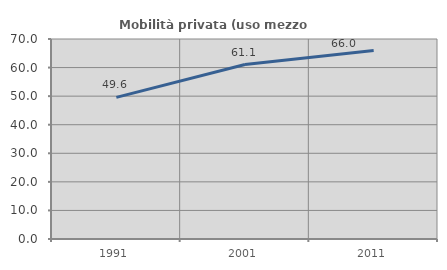
| Category | Mobilità privata (uso mezzo privato) |
|---|---|
| 1991.0 | 49.584 |
| 2001.0 | 61.052 |
| 2011.0 | 65.985 |